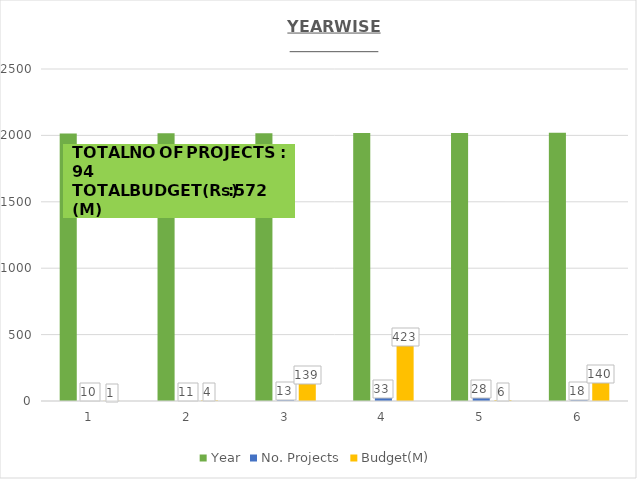
| Category | Year | No. Projects | Budget(M) |
|---|---|---|---|
| 0 | 2015 | 10 | 1.055 |
| 1 | 2016 | 11 | 3.825 |
| 2 | 2017 | 13 | 138.759 |
| 3 | 2018 | 33 | 423.154 |
| 4 | 2019 | 28 | 5.637 |
| 5 | 2020 | 18 | 140 |